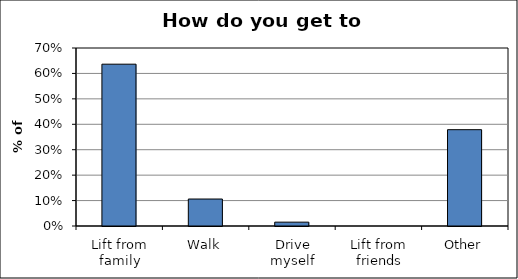
| Category | Series 0 |
|---|---|
| Lift from family | 0.636 |
| Walk | 0.106 |
| Drive myself | 0.015 |
| Lift from friends | 0 |
| Other | 0.379 |